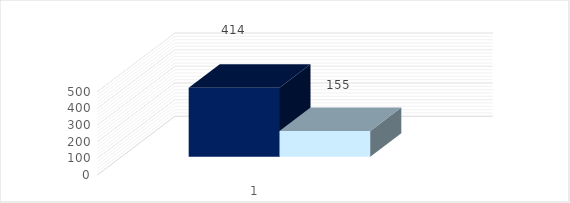
| Category | положительных |
|---|---|
| 0 | 155 |